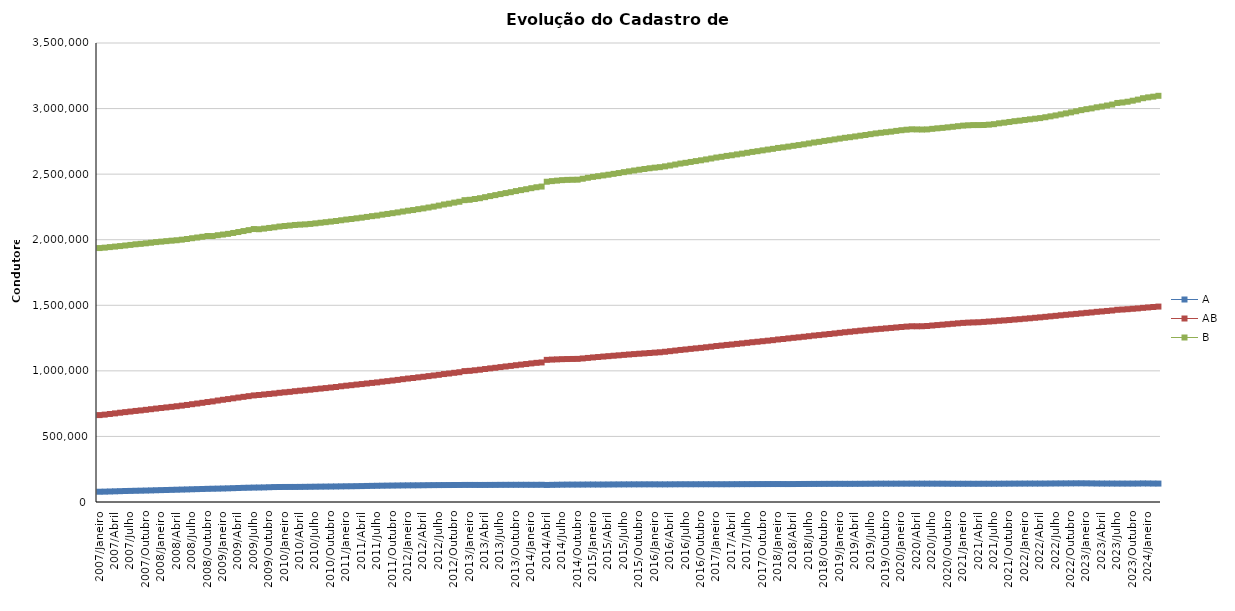
| Category | A | AB | B |
|---|---|---|---|
| 2007/Janeiro | 78339 | 662687 | 1936381 |
| 2007/Fevereiro | 79078 | 666322 | 1939479 |
| 2007/Março | 80256 | 671259 | 1943715 |
| 2007/Abril | 81364 | 675754 | 1947564 |
| 2007/Maio | 82551 | 680772 | 1951491 |
| 2007/Junho | 83749 | 685305 | 1955838 |
| 2007/Julho | 84645 | 689669 | 1960327 |
| 2007/Agosto | 85630 | 694408 | 1965165 |
| 2007/Setembro | 86399 | 698346 | 1968387 |
| 2007/Outubro | 87316 | 702912 | 1972538 |
| 2007/Novembro | 88339 | 707624 | 1976788 |
| 2007/Dezembro | 89528 | 712351 | 1981782 |
| 2008/Janeiro | 90600 | 716994 | 1985306 |
| 2008/Fevereiro | 91598 | 721215 | 1989171 |
| 2008/Março | 92619 | 725560 | 1992712 |
| 2008/Abril | 93708 | 730139 | 1995923 |
| 2008/Maio | 94834 | 734945 | 2000343 |
| 2008/Junho | 95853 | 739988 | 2005357 |
| 2008/Julho | 97010 | 745721 | 2011362 |
| 2008/Agosto | 98183 | 750891 | 2016749 |
| 2008/Setembro | 99339 | 756352 | 2022267 |
| 2008/Outubro | 100406 | 762253 | 2028505 |
| 2008/Novembro | 101206 | 767035 | 2027963 |
| 2008/Dezembro | 101984 | 773761 | 2034277 |
| 2009/Janeiro | 103037 | 779599 | 2039448 |
| 2009/Fevereiro | 104093 | 784637 | 2044637 |
| 2009/Março | 105435 | 790605 | 2051447 |
| 2009/Abril | 106757 | 796329 | 2058576 |
| 2009/Maio | 108079 | 801836 | 2065963 |
| 2009/Junho | 108964 | 807138 | 2073013 |
| 2009/Julho | 109948 | 812681 | 2081324 |
| 2009/Agosto | 110476 | 815980 | 2079988 |
| 2009/Setembro | 111217 | 820035 | 2084657 |
| 2009/Outubro | 112605 | 823940 | 2089744 |
| 2009/Novembro | 113921 | 827629 | 2094557 |
| 2009/Dezembro | 114420 | 832595 | 2100453 |
| 2010/Janeiro | 114636 | 836465 | 2104634 |
| 2010/Fevereiro | 114770 | 839928 | 2108253 |
| 2010/Março | 114809 | 844821 | 2112440 |
| 2010/Abril | 115140 | 848547 | 2115005 |
| 2010/Maio | 115639 | 852175 | 2117066 |
| 2010/Junho | 116176 | 856224 | 2120380 |
| 2010/Julho | 116713 | 860603 | 2124778 |
| 2010/Agosto | 117242 | 864813 | 2129320 |
| 2010/Setembro | 117593 | 868600 | 2133645 |
| 2010/Outubro | 118048 | 872947 | 2138176 |
| 2010/Novembro | 118496 | 877093 | 2142847 |
| 2010/Dezembro | 119150 | 882503 | 2148315 |
| 2011/Janeiro | 119745 | 886853 | 2153596 |
| 2011/Fevereiro | 120114 | 890841 | 2157800 |
| 2011/Março | 120776 | 895331 | 2163141 |
| 2011/Abril | 121472 | 899305 | 2168170 |
| 2011/Maio | 122333 | 903633 | 2173821 |
| 2011/Junho | 123012 | 908086 | 2179733 |
| 2011/Julho | 123705 | 911994 | 2184166 |
| 2011/Agosto | 124386 | 917379 | 2191164 |
| 2011/Setembro | 124879 | 921583 | 2196566 |
| 2011/Outubro | 125381 | 926225 | 2202361 |
| 2011/Novembro | 125899 | 931073 | 2208147 |
| 2011/Dezembro | 126447 | 936539 | 2215021 |
| 2012/Janeiro | 126877 | 941330 | 2221296 |
| 2012/Fevereiro | 127117 | 945491 | 2226229 |
| 2012/Março | 127325 | 950538 | 2232874 |
| 2012/Abril | 127754 | 954904 | 2238686 |
| 2012/Maio | 128324 | 959959 | 2245535 |
| 2012/Junho | 128674 | 964784 | 2252453 |
| 2012/Julho | 128992 | 969723 | 2260185 |
| 2012/Agosto | 129202 | 975564 | 2268721 |
| 2012/Setembro | 129369 | 979853 | 2274812 |
| 2012/Outubro | 129609 | 985089 | 2282984 |
| 2012/Novembro | 129852 | 989534 | 2289455 |
| 2012/Dezembro | 130177 | 998134 | 2301652 |
| 2013/Janeiro | 130177 | 1000109 | 2304385 |
| 2013/Fevereiro | 130095 | 1004448 | 2310305 |
| 2013/Março | 129977 | 1008890 | 2316513 |
| 2013/Abril | 130057 | 1013931 | 2324401 |
| 2013/Maio | 130271 | 1019012 | 2332676 |
| 2013/Junho | 130450 | 1023409 | 2339994 |
| 2013/Julho | 130824 | 1028635 | 2347900 |
| 2013/Agosto | 130907 | 1033465 | 2355508 |
| 2013/Setembro | 131043 | 1037864 | 2362527 |
| 2013/Outubro | 131072 | 1042921 | 2370811 |
| 2013/Novembro | 131181 | 1047510 | 2378129 |
| 2013/Dezembro | 131206 | 1052033 | 2385013 |
| 2014/Janeiro | 131020 | 1056842 | 2392930 |
| 2014/Fevereiro | 131018 | 1061116 | 2400045 |
| 2014/Março | 131336 | 1064144 | 2405258 |
| 2014/Abril | 129907 | 1083870 | 2442146 |
| 2014/Maio | 130816 | 1086012 | 2446827 |
| 2014/Junho | 131467 | 1087632 | 2450492 |
| 2014/Julho | 132197 | 1089225 | 2454305 |
| 2014/Agosto | 132620 | 1090172 | 2456182 |
| 2014/Setembro | 132697 | 1090725 | 2457019 |
| 2014/Outubro | 132727 | 1091227 | 2457710 |
| 2014/Novembro | 132891 | 1094797 | 2464958 |
| 2014/Dezembro | 133251 | 1098545 | 2472458 |
| 2015/Janeiro | 133298 | 1102270 | 2479080 |
| 2015/Fevereiro | 133180 | 1105433 | 2484369 |
| 2015/Março | 133225 | 1108992 | 2490262 |
| 2015/Abril | 133523 | 1112151 | 2495742 |
| 2015/Maio | 133833 | 1115341 | 2502194 |
| 2015/Junho | 134104 | 1118428 | 2508287 |
| 2015/Julho | 134244 | 1121823 | 2515190 |
| 2015/Agosto | 134423 | 1124901 | 2521371 |
| 2015/Setembro | 134554 | 1127863 | 2527684 |
| 2015/Outubro | 134596 | 1130651 | 2533689 |
| 2015/Novembro | 134707 | 1133268 | 2539097 |
| 2015/Dezembro | 134791 | 1136302 | 2544855 |
| 2016/Janeiro | 134685 | 1139015 | 2549436 |
| 2016/Fevereiro | 134529 | 1141730 | 2553241 |
| 2016/Março | 134494 | 1145666 | 2559223 |
| 2016/Abril | 134753 | 1150141 | 2565920 |
| 2016/Maio | 135029 | 1154632 | 2573181 |
| 2016/Junho | 135293 | 1159439 | 2580806 |
| 2016/Julho | 135348 | 1163140 | 2586364 |
| 2016/Agosto | 135308 | 1167635 | 2592983 |
| 2016/Setembro | 135361 | 1171584 | 2599490 |
| 2016/Outubro | 135459 | 1175390 | 2605483 |
| 2016/Novembro | 135506 | 1179900 | 2612210 |
| 2016/Dezembro | 135514 | 1184269 | 2619190 |
| 2017/Janeiro | 135474 | 1189318 | 2626642 |
| 2017/Fevereiro | 135452 | 1193110 | 2632203 |
| 2017/Março | 135549 | 1197730 | 2639116 |
| 2017/Abril | 135741 | 1201230 | 2643952 |
| 2017/Maio | 135967 | 1205702 | 2650431 |
| 2017/Junho | 136222 | 1209617 | 2656401 |
| 2017/Julho | 136297 | 1213836 | 2662849 |
| 2017/Agosto | 136491 | 1218317 | 2669583 |
| 2017/Setembro | 136610 | 1221972 | 2674979 |
| 2017/Outubro | 136732 | 1226007 | 2681228 |
| 2017/Novembro | 136877 | 1230013 | 2687352 |
| 2017/Dezembro | 136941 | 1234077 | 2692944 |
| 2018/Janeiro | 136961 | 1239230 | 2699845 |
| 2018/Fevereiro | 136861 | 1243077 | 2704334 |
| 2018/Março | 136746 | 1247604 | 2710001 |
| 2018/Abril | 136874 | 1251918 | 2716059 |
| 2018/Maio | 137200 | 1255730 | 2721619 |
| 2018/Junho | 137503 | 1259988 | 2727492 |
| 2018/Julho | 137733 | 1264253 | 2733946 |
| 2018/Agosto | 137877 | 1269144 | 2741222 |
| 2018/Setembro | 138022 | 1272687 | 2746265 |
| 2018/Outubro | 138260 | 1277095 | 2753331 |
| 2018/Novembro | 138357 | 1281157 | 2758661 |
| 2018/Dezembro | 138482 | 1285338 | 2764827 |
| 2019/Janeiro | 138567 | 1289892 | 2771065 |
| 2019/Fevereiro | 138472 | 1294437 | 2777166 |
| 2019/Março | 138417 | 1298173 | 2781670 |
| 2019/Abril | 138618 | 1302208 | 2787397 |
| 2019/Maio | 138760 | 1306323 | 2793240 |
| 2019/Junho | 139011 | 1309692 | 2798618 |
| 2019/Julho | 139239 | 1313680 | 2804890 |
| 2019/Agosto | 139569 | 1317278 | 2810587 |
| 2019/Setembro | 139756 | 1320449 | 2815306 |
| 2019/Outubro | 139787 | 1323920 | 2819853 |
| 2019/Novembro | 139735 | 1327263 | 2824127 |
| 2019/Dezembro | 139824 | 1330819 | 2829812 |
| 2020/Janeiro | 139929 | 1334470 | 2834887 |
| 2020/Fevereiro | 139894 | 1337574 | 2838808 |
| 2020/Março | 139951 | 1340104 | 2841932 |
| 2020/Abril | 139919 | 1339824 | 2841009 |
| 2020/Maio | 139902 | 1340245 | 2840191 |
| 2020/Junho | 139889 | 1342033 | 2841071 |
| 2020/Julho | 139803 | 1345740 | 2845449 |
| 2020/Agosto | 139693 | 1349110 | 2849373 |
| 2020/Setembro | 139589 | 1352188 | 2852770 |
| 2020/Outubro | 139319 | 1355676 | 2856887 |
| 2020/Novembro | 139098 | 1358973 | 2861095 |
| 2020/Dezembro | 139013 | 1362484 | 2865653 |
| 2021/Janeiro | 139086 | 1365670 | 2870052 |
| 2021/Fevereiro | 139086 | 1367895 | 2872522 |
| 2021/Março | 138954 | 1369419 | 2874146 |
| 2021/Abril | 138994 | 1370569 | 2874213 |
| 2021/Maio | 139257 | 1373216 | 2874859 |
| 2021/Junho | 139250 | 1376096 | 2877343 |
| 2021/Julho | 139307 | 1378589 | 2881041 |
| 2021/Agosto | 139516 | 1382023 | 2887617 |
| 2021/Setembro | 139723 | 1384618 | 2892454 |
| 2021/Outubro | 139949 | 1387507 | 2897878 |
| 2021/Novembro | 140126 | 1391124 | 2903782 |
| 2021/Dezembro | 140308 | 1394019 | 2907772 |
| 2022/Janeiro | 140429 | 1397712 | 2913171 |
| 2022/Fevereiro | 140557 | 1400889 | 2918003 |
| 2022/Março | 140543 | 1404658 | 2922811 |
| 2022/Abril | 140580 | 1408106 | 2927322 |
| 2022/Maio | 140663 | 1411921 | 2933783 |
| 2022/Junho | 141107 | 1415906 | 2940678 |
| 2022/Julho | 141431 | 1419478 | 2947567 |
| 2022/Agosto | 141665 | 1423785 | 2955418 |
| 2022/Setembro | 141825 | 1427454 | 2963172 |
| 2022/Outubro | 142124 | 1430927 | 2971021 |
| 2022/Novembro | 142410 | 1434473 | 2979447 |
| 2022/Dezembro | 142488 | 1438478 | 2988085 |
| 2023/Janeiro | 142190 | 1442377 | 2995415 |
| 2023/Fevereiro | 141687 | 1445604 | 3001256 |
| 2023/Março | 141044 | 1450124 | 3009634 |
| 2023/Abril | 140775 | 1453150 | 3015539 |
| 2023/Maio | 140682 | 1456838 | 3023269 |
| 2023/Junho | 140626 | 1460304 | 3030628 |
| 2023/Julho | 140423 | 1465713 | 3042778 |
| 2023/Agosto | 140452 | 1467598 | 3046495 |
| 2023/Setembro | 140368 | 1470204 | 3052202 |
| 2023/Outubro | 140499 | 1473370 | 3060154 |
| 2023/Novembro | 140780 | 1476369 | 3068277 |
| 2023/Dezembro | 141600 | 1480451 | 3079026 |
| 2024/Janeiro | 141268 | 1483727 | 3085427 |
| 2024/Fevereiro | 140763 | 1487048 | 3090740 |
| 2024/Março | 140539 | 1490154 | 3097353 |